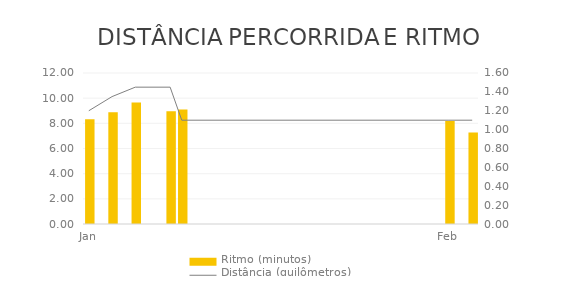
| Category | Ritmo (minutos) |
|---|---|
| 2012-01-01 | 8.333 |
| 2012-01-03 | 8.889 |
| 2012-01-05 | 9.655 |
| 2012-01-08 | 8.966 |
| 2012-01-09 | 9.091 |
| 2012-02-01 | 8.182 |
| 2012-02-03 | 7.273 |